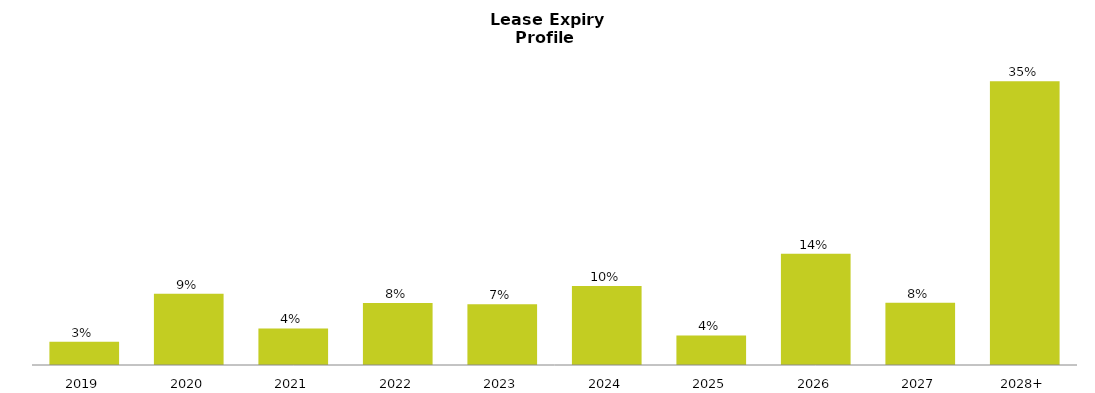
| Category | Weighted |
|---|---|
| 2019.0 | 0.028 |
| 2020.0 | 0.087 |
| 2021.0 | 0.045 |
| 2022.0 | 0.076 |
| 2023.0 | 0.074 |
| 2024.0 | 0.096 |
| 2025.0 | 0.036 |
| 2026.0 | 0.136 |
| 2027.0 | 0.076 |
| 2028.0 | 0.346 |